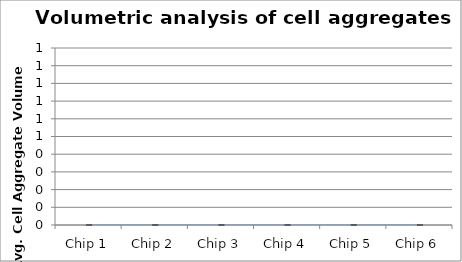
| Category | Volume |
|---|---|
| Chip 1 | 0 |
| Chip 2 | 0 |
| Chip 3 | 0 |
| Chip 4 | 0 |
| Chip 5 | 0 |
| Chip 6 | 0 |